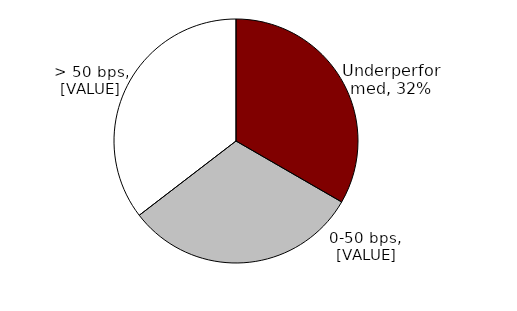
| Category | Series 0 |
|---|---|
| Underperformed | 0.333 |
| 0-50 bps | 0.312 |
| > 50 bps | 0.354 |